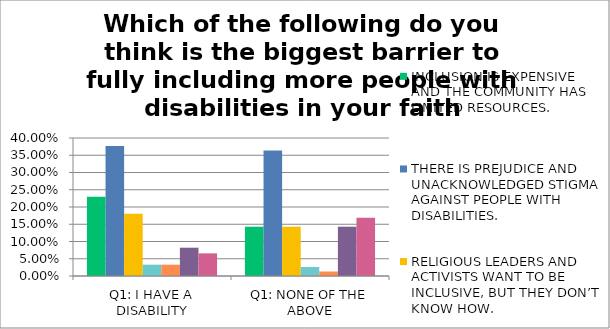
| Category | INCLUSION IS EXPENSIVE AND THE COMMUNITY HAS LIMITED RESOURCES. | THERE IS PREJUDICE AND UNACKNOWLEDGED STIGMA AGAINST PEOPLE WITH DISABILITIES. | RELIGIOUS LEADERS AND ACTIVISTS WANT TO BE INCLUSIVE, BUT THEY DON’T KNOW HOW. | OTHER EMERGENCIES AND COMMUNAL NEEDS ARE MORE PRESSING. | THE AMERICANS WITH DISABILITIES ACT (ADA) EXEMPTED RELIGIOUS INSTITUTIONS. | THERE AREN’T MANY PEOPLE WITH DISABILITIES AND THOSE IN THE COMMUNITY ARE INCLUDED. | INCLUDING PEOPLE WITH DISABILITIES CAN BE COMPLICATED AND WE DON’T HAVE THE EXPERTISE TO SERVE EVERY NEED. |
|---|---|---|---|---|---|---|---|
| Q1: I HAVE A DISABILITY | 0.23 | 0.377 | 0.18 | 0.033 | 0.033 | 0.082 | 0.066 |
| Q1: NONE OF THE ABOVE | 0.143 | 0.364 | 0.143 | 0.026 | 0.013 | 0.143 | 0.169 |